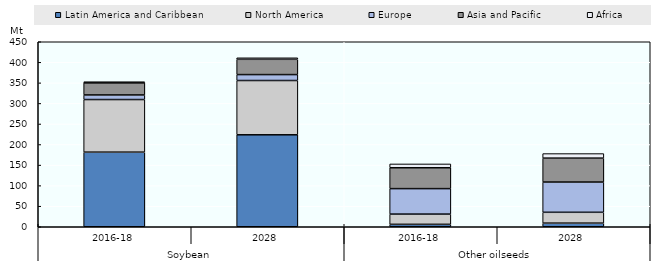
| Category | Latin America and Caribbean | North America | Europe | Asia and Pacific | Africa |
|---|---|---|---|---|---|
| 0 | 181.455 | 127.995 | 11.171 | 29.416 | 2.801 |
| 1 | 223.704 | 132.032 | 14.386 | 37.235 | 3.646 |
| 2 | 5.862 | 24.946 | 61.93 | 50.797 | 9.281 |
| 3 | 8.789 | 26.379 | 73.597 | 58.185 | 11.045 |